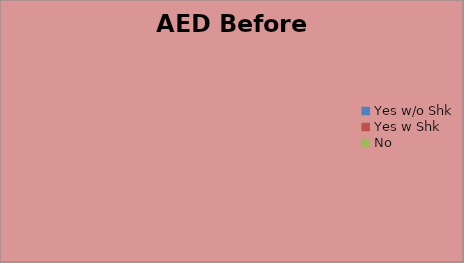
| Category | AED Before EMS |
|---|---|
| Yes w/o Shk | 0 |
| Yes w Shk | 0 |
| No | 0 |